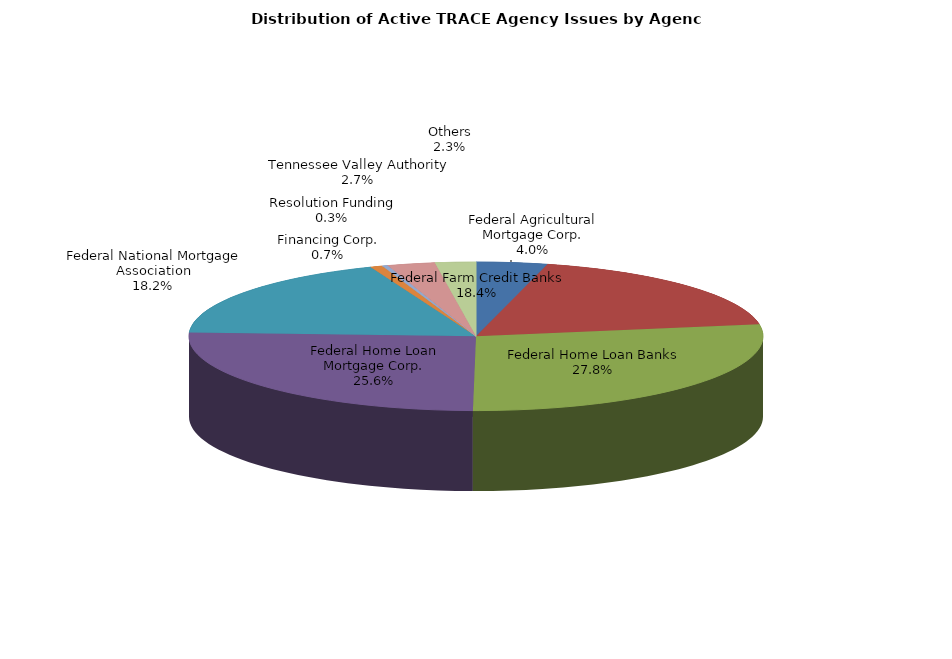
| Category | Series 0 |
|---|---|
| Federal Agricultural Mortgage Corp. | 790 |
| Federal Farm Credit Banks | 3627 |
| Federal Home Loan Banks | 5482 |
| Federal Home Loan Mortgage Corp. | 5060 |
| Federal National Mortgage Association | 3592 |
| Financing Corp. | 134 |
| Resolution Funding | 62 |
| Tennessee Valley Authority | 531 |
| Others | 452 |